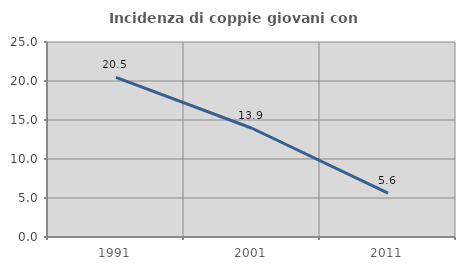
| Category | Incidenza di coppie giovani con figli |
|---|---|
| 1991.0 | 20.465 |
| 2001.0 | 13.943 |
| 2011.0 | 5.631 |